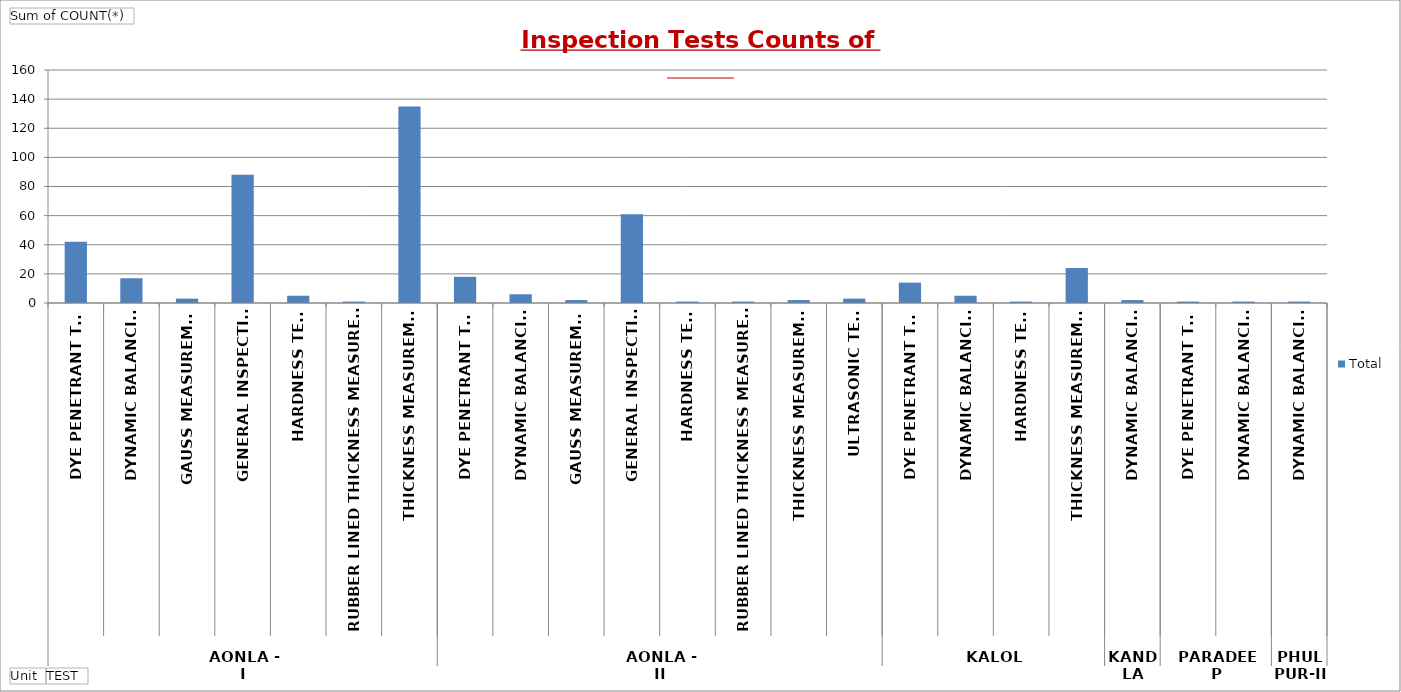
| Category | Total |
|---|---|
| 0 | 42 |
| 1 | 17 |
| 2 | 3 |
| 3 | 88 |
| 4 | 5 |
| 5 | 1 |
| 6 | 135 |
| 7 | 18 |
| 8 | 6 |
| 9 | 2 |
| 10 | 61 |
| 11 | 1 |
| 12 | 1 |
| 13 | 2 |
| 14 | 3 |
| 15 | 14 |
| 16 | 5 |
| 17 | 1 |
| 18 | 24 |
| 19 | 2 |
| 20 | 1 |
| 21 | 1 |
| 22 | 1 |